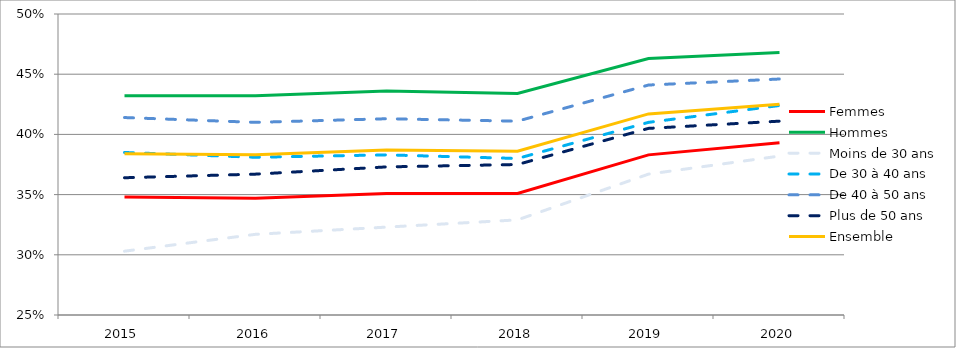
| Category | Femmes | Hommes | Moins de 30 ans | De 30 à 40 ans | De 40 à 50 ans | Plus de 50 ans | Ensemble |
|---|---|---|---|---|---|---|---|
| 2015 | 0.348 | 0.432 | 0.303 | 0.385 | 0.414 | 0.364 | 0.384 |
| 2016 | 0.347 | 0.432 | 0.317 | 0.381 | 0.41 | 0.367 | 0.383 |
| 2017 | 0.351 | 0.436 | 0.323 | 0.383 | 0.413 | 0.373 | 0.387 |
| 2018 | 0.351 | 0.434 | 0.329 | 0.38 | 0.411 | 0.375 | 0.386 |
| 2019 | 0.383 | 0.463 | 0.367 | 0.41 | 0.441 | 0.405 | 0.417 |
| 2020 | 0.393 | 0.468 | 0.382 | 0.424 | 0.446 | 0.411 | 0.425 |